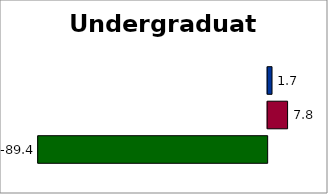
| Category | State | SREB states | 50 states and D.C. |
|---|---|---|---|
| 0 | -89.389 | 7.758 | 1.7 |